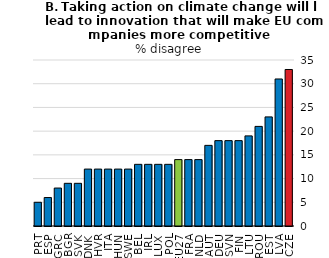
| Category | Series 1 |
|---|---|
| PRT | 5 |
| ESP | 6 |
| GRC | 8 |
| BGR | 9 |
| SVK | 9 |
| DNK | 12 |
| HVR | 12 |
| ITA | 12 |
| HUN | 12 |
| SWE | 12 |
| BEL | 13 |
| IRL | 13 |
| LUX | 13 |
| POL | 13 |
| EU27 | 14 |
| FRA | 14 |
| NLD | 14 |
| AUT | 17 |
| DEU | 18 |
| SVN | 18 |
| FIN | 18 |
| LTU | 19 |
| ROU | 21 |
| EST | 23 |
| LVA | 31 |
| CZE | 33 |